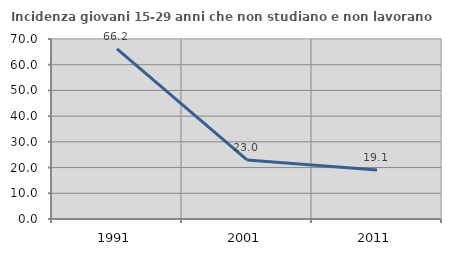
| Category | Incidenza giovani 15-29 anni che non studiano e non lavorano  |
|---|---|
| 1991.0 | 66.193 |
| 2001.0 | 22.976 |
| 2011.0 | 19.074 |